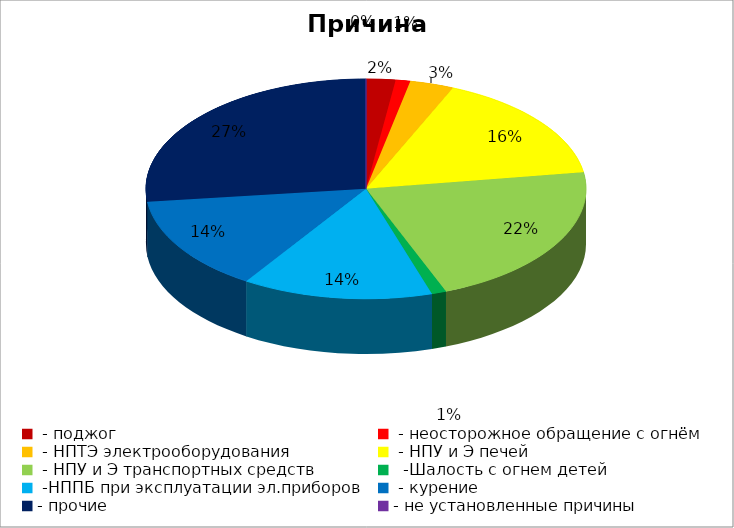
| Category | Причина пожара |
|---|---|
|  - поджог | 2 |
|  - неосторожное обращение с огнём | 1 |
|  - НПТЭ электрооборудования | 3 |
|  - НПУ и Э печей | 15 |
|  - НПУ и Э транспортных средств | 20 |
|   -Шалость с огнем детей | 1 |
|  -НППБ при эксплуатации эл.приборов | 13 |
|  - курение | 13 |
| - прочие | 25 |
| - не установленные причины | 0 |